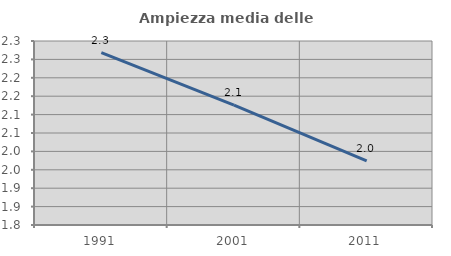
| Category | Ampiezza media delle famiglie |
|---|---|
| 1991.0 | 2.268 |
| 2001.0 | 2.126 |
| 2011.0 | 1.974 |